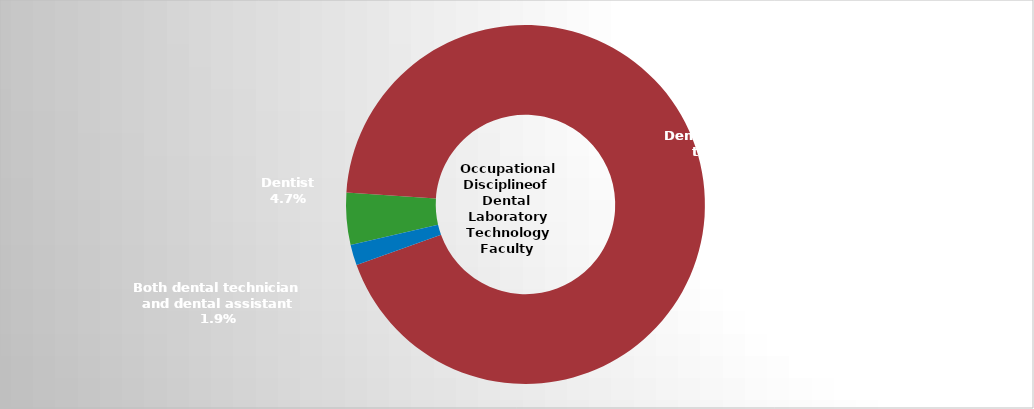
| Category | Series 2 |
|---|---|
| Dentist | 0.047 |
| Dental laboratory technician | 0.935 |
| Both dental technician and dental assistant | 0.019 |